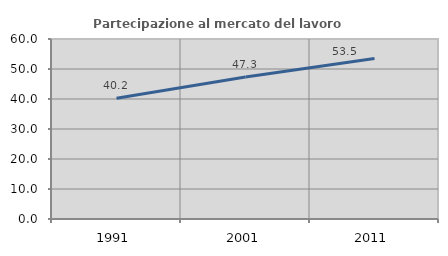
| Category | Partecipazione al mercato del lavoro  femminile |
|---|---|
| 1991.0 | 40.224 |
| 2001.0 | 47.306 |
| 2011.0 | 53.467 |